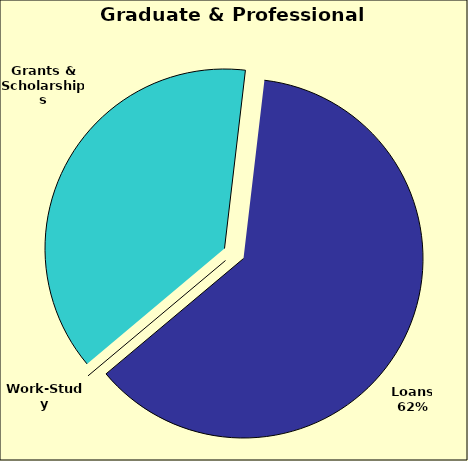
| Category | Series 0 |
|---|---|
| Grants & Scholarships | 0.38 |
| Loans | 0.62 |
| Work-Study | 0 |